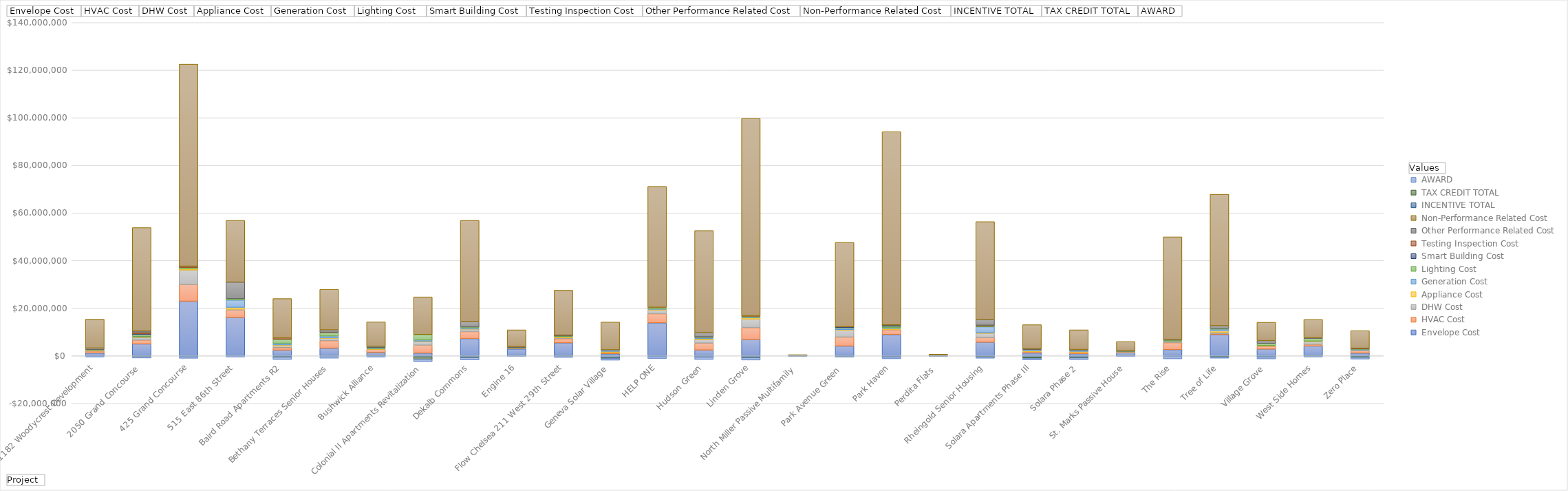
| Category |  Envelope Cost |  HVAC Cost |  DHW Cost |  Appliance Cost |  Generation Cost |  Lighting Cost  |  Smart Building Cost |  Testing Inspection Cost |  Other Performance Related Cost |  Non-Performance Related Cost |  INCENTIVE TOTAL |  TAX CREDIT TOTAL |  AWARD |
|---|---|---|---|---|---|---|---|---|---|---|---|---|---|
| 1182 Woodycrest Development | 1130801.59 | 879051 | 240000 | 140736 | 0 | 200000 | 0 | 0 | 645948 | 12128463.81 | -169700 | 0 | -350931 |
| 2050 Grand Concourse  | 4967658.213 | 1592848.164 | 1059435.67 | 183414 | 254596.04 | 807248.033 | 325541.73 | 689125 | 502235.25 | 43460922.157 | -235624 | -55599 | -647500 |
| 425 Grand Concourse | 22898351.84 | 6998906 | 6106206 | 434701 | 0 | 617156 | 0 | 546700 | 50300 | 84887679.16 | -300000 | 0 | -750000 |
| 515 East 86th Street  | 16052777 | 3168000 | 307000 | 788116 | 3072683 | 553272 | 0 | 0 | 7001039.706 | 25917381.706 | -99617.8 | 0 | -425000 |
| Baird Road Apartments R2 | 2359448 | 1068480 | 740740 | 357200 | 679542 | 1711476 | 0 | 580375 | 0 | 16517486 | -414103 | -142814 | -1000000 |
| Bethany Terraces Senior Houses | 3168985 | 3176351 | 1039500 | 128262 | 768000 | 1422180 | 0 | 172420 | 983657 | 17051589 | -199800 | 0 | -810400 |
| Bushwick Alliance | 1357000 | 1360000 | 53000 | 80000 | 228000 | 355000 | 0 | 0 | 534413 | 10261135 | -70000 | -67354 | -401180 |
| Colonial II Apartments Revitalization | 1096000 | 3357410 | 1467133 | 169375 | 505440 | 2335100 | 0 | 0 | 0 | 15804978 | -459000 | -990064 | -1000000 |
| Dekalb Commons | 7230000 | 2925000 | 1050000 | 151700 | 374500 | 340000 | 0 | 0 | 2283800 | 42507863.5 | -619232 | -111363 | -1000000 |
| Engine 16 | 2859020.71 | 245125 | 153472 | 69500 | 39415 | 41750 | 0 | 0 | 423479.42 | 7052230.21 | -6400 | -19088 | -167458.5 |
| Flow Chelsea 211 West 29th Street | 5414207.77 | 1755748.5 | 356582 | 462963.94 | 157000 | 246715.67 | 50000 | 53050 | 198249.76 | 18820784.21 | -145660 | -49394 | -500000 |
| Geneva Solar Village | 823994 | 520783 | 73950 | 410325 | 571158 | 41511 | 0 | 0 | 64637.931 | 11648847 | -978000 | -140885 | -727236 |
| HELP ONE | 13820490 | 3860000 | 1521600 | 291269 | 263398 | 468693 | 0 | 142906 | 0 | 50797762.19 | -300000 | 0 | -850000 |
| Hudson Green | 2407694.931 | 2900092.81 | 1545000 | 374147 | 411400 | 281632.424 | 0 | 37000 | 1742800 | 42929555.668 | -555000 | 0 | -1000000 |
| Linden Grove | 6779865.441 | 5074592.04 | 3559889.291 | 572717.547 | 232500 | 400000 | 0 | 189900 | 0 | 82895592.98 | -700000 | -100000 | -1000000 |
| North Miller Passive Multifamily | 96977.91 | 8539.65 | 5400 | 7000 | 27815 | 2147.13 | 2300 | 7650 | 5000 | 289777.66 | -12600 | -14255 | -39467 |
| Park Avenue Green  | 4079691.16 | 3770484.94 | 3048214.42 | 63526 | 682830 | 141119.7 | 365000 | 73675 | 0 | 35399236.42 | -270600 | -20400 | -250000 |
| Park Haven | 8918168 | 2028100 | 91500 | 404336 | 339261 | 639515.63 | 403739.06 | 45775 | 100000 | 81164882.15 | -508200 | 0 | -750000 |
| Perdita Flats  | 64925.8 | 30000 | 12400 | 21000 | 34600 | 750 | 0 | 0 | 0 | 500484.2 | -6400 | -14933 | -59976 |
| Rheingold Senior Housing | 5651719.02 | 1965400 | 1791250 | 239216.96 | 2535918.75 | 294500 | 0 | 310000 | 2405000 | 41171001.61 | -339240 | -52250 | -637500 |
| Solara Apartments Phase III | 1158315 | 575523 | 60000 | 293556 | 678000 | 51000 | 45000 | 22372 | 131321 | 10040663.95 | -587500 | -415800 | -750000 |
| Solara Phase 2 | 884237 | 575523 | 60000 | 299400 | 678000 | 51000 | 45000 | 20826 | 0 | 8280460 | -571050 | -283035 | -750000 |
| St. Marks Passive House | 1286500 | 275000 | 105000 | 120000 | 40000 | 80000 | 0 | 0 | 186730 | 3887850 | -13608 | -29906 | -203082 |
| The Rise | 2579052 | 2922400 | 300000 | 212800 | 273845 | 280000 | 0 | 0 | 260966 | 43128939.45 | -279680 | 0 | -1000000 |
| Tree of Life | 8908493.25 | 366127.83 | 575000 | 625000 | 679194.51 | 300000 | 0 | 0 | 1195947.3 | 55205071.24 | -320000 | -185526 | -500000 |
| Village Grove | 2770500 | 1174200 | 320280 | 30642.95 | 0 | 888684 | 0 | 0 | 1189475 | 7697481.89 | -513976 | 0 | -792438 |
| West Side Homes | 4104825.56 | 695077 | 1134500 | 99865 | 119136.74 | 1135010 | 0 | 0 | 224844.694 | 7763945.9 | -115819 | -27878 | -362620 |
| Zero Place | 1101500 | 1100000 | 50000 | 110630 | 475000 | 10000 | 215000 | 45000 | 0 | 7440183 | -315040 | -313400 | -750000 |